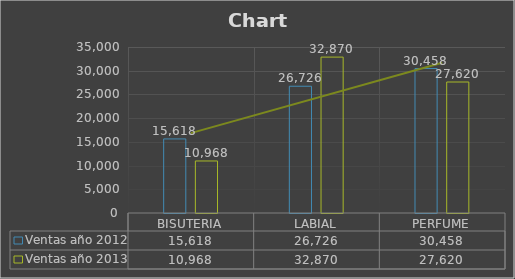
| Category | Ventas año 2012 | Ventas año 2013 |
|---|---|---|
| BISUTERIA | 15618 | 10968 |
| LABIAL | 26726 | 32870 |
| PERFUME | 30458 | 27620 |